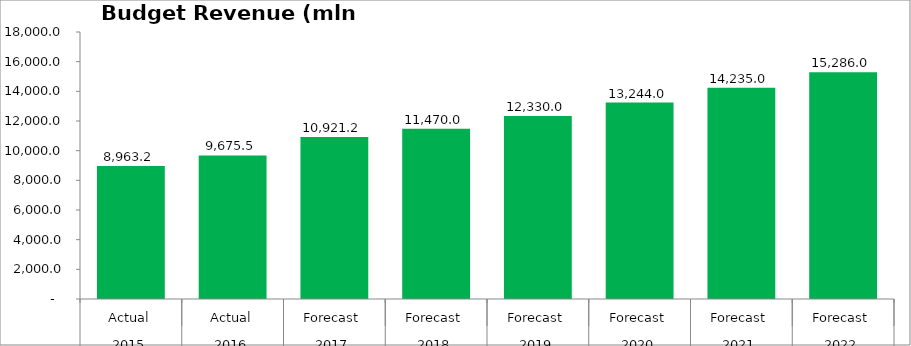
| Category | Budget Revenue (mln GEL) |
|---|---|
| 0 | 8963.173 |
| 1 | 9675.507 |
| 2 | 10921.174 |
| 3 | 11470 |
| 4 | 12330 |
| 5 | 13244 |
| 6 | 14235 |
| 7 | 15286 |